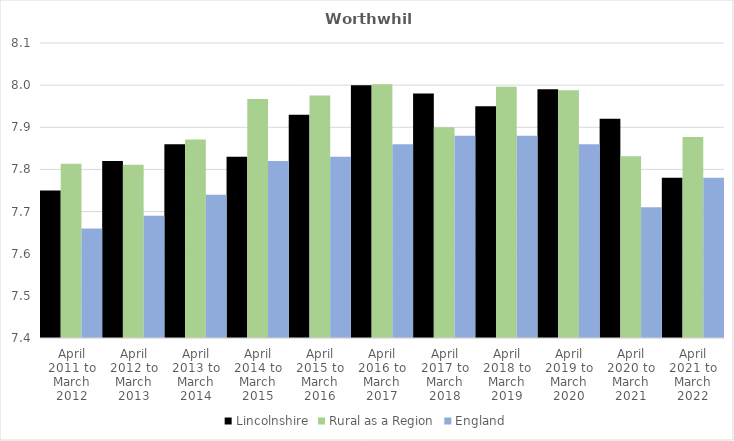
| Category | Lincolnshire | Rural as a Region | England |
|---|---|---|---|
| April 2011 to March 2012 | 7.75 | 7.813 | 7.66 |
| April 2012 to March 2013 | 7.82 | 7.811 | 7.69 |
| April 2013 to March 2014 | 7.86 | 7.871 | 7.74 |
| April 2014 to March 2015 | 7.83 | 7.967 | 7.82 |
| April 2015 to March 2016 | 7.93 | 7.975 | 7.83 |
| April 2016 to March 2017 | 8 | 8.002 | 7.86 |
| April 2017 to March 2018 | 7.98 | 7.9 | 7.88 |
| April 2018 to March 2019 | 7.95 | 7.996 | 7.88 |
| April 2019 to March 2020 | 7.99 | 7.988 | 7.86 |
| April 2020 to March 2021 | 7.92 | 7.831 | 7.71 |
| April 2021 to March 2022 | 7.78 | 7.877 | 7.78 |